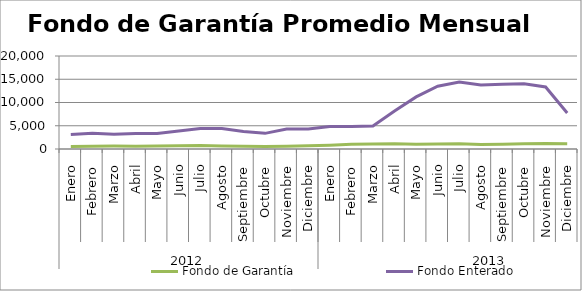
| Category | Fondo de Garantía | Fondo Enterado |
|---|---|---|
| 0 | 560.173 | 3141.641 |
| 1 | 575.916 | 3362.648 |
| 2 | 622.075 | 3154.118 |
| 3 | 612.299 | 3348.058 |
| 4 | 654.277 | 3308.859 |
| 5 | 675.965 | 3850.375 |
| 6 | 729.97 | 4400.539 |
| 7 | 649.095 | 4383.327 |
| 8 | 606.03 | 3757.632 |
| 9 | 525.314 | 3362.932 |
| 10 | 591.646 | 4285.609 |
| 11 | 703.403 | 4296.87 |
| 12 | 823.344 | 4842.786 |
| 13 | 1008.855 | 4845.136 |
| 14 | 1091.101 | 4938.365 |
| 15 | 1128.09 | 8179.666 |
| 16 | 1047.818 | 11202.213 |
| 17 | 1079.154 | 13493.433 |
| 18 | 1130.244 | 14387.844 |
| 19 | 950.791 | 13769.803 |
| 20 | 1002.474 | 13899.147 |
| 21 | 1106.654 | 14005.922 |
| 22 | 1178.354 | 13346.59 |
| 23 | 1128.199 | 7751.204 |